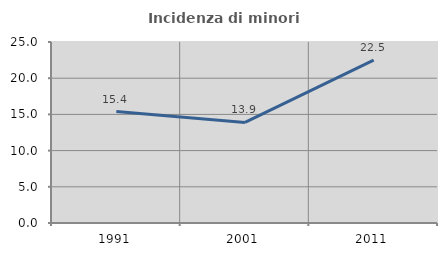
| Category | Incidenza di minori stranieri |
|---|---|
| 1991.0 | 15.385 |
| 2001.0 | 13.889 |
| 2011.0 | 22.5 |